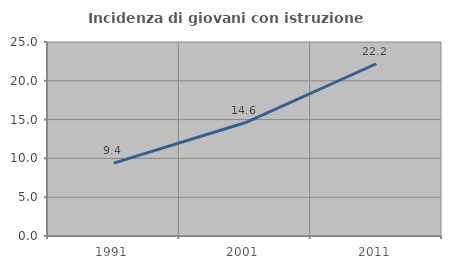
| Category | Incidenza di giovani con istruzione universitaria |
|---|---|
| 1991.0 | 9.394 |
| 2001.0 | 14.588 |
| 2011.0 | 22.197 |